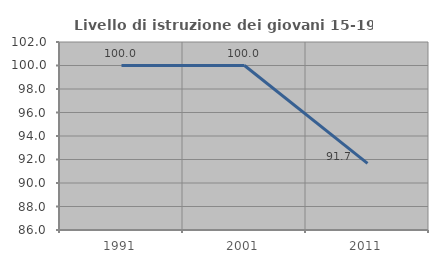
| Category | Livello di istruzione dei giovani 15-19 anni |
|---|---|
| 1991.0 | 100 |
| 2001.0 | 100 |
| 2011.0 | 91.667 |